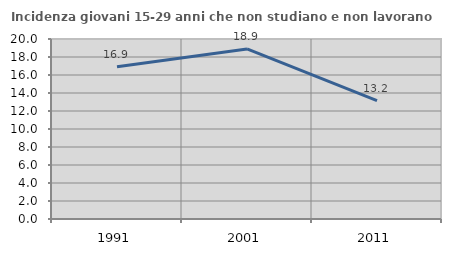
| Category | Incidenza giovani 15-29 anni che non studiano e non lavorano  |
|---|---|
| 1991.0 | 16.91 |
| 2001.0 | 18.898 |
| 2011.0 | 13.158 |